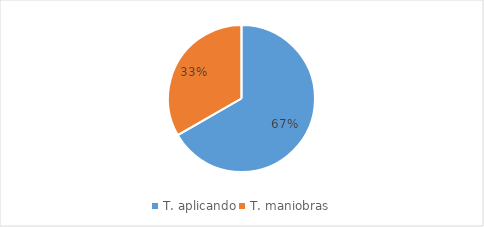
| Category | Series 0 |
|---|---|
| T. aplicando | 0.667 |
| T. maniobras | 0.333 |